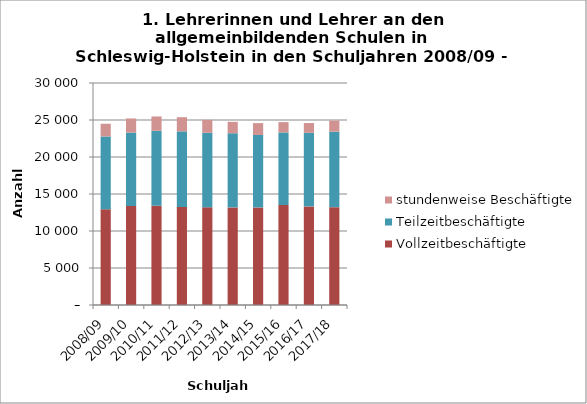
| Category | Vollzeitbeschäftigte | Teilzeitbeschäftigte | stundenweise Beschäftigte |
|---|---|---|---|
| 2008/09 | 12933 | 9836 | 1725 |
| 2009/10 | 13376 | 9922 | 1910 |
| 2010/11 | 13417 | 10129 | 1930 |
| 2011/12 | 13244 | 10218 | 1917 |
| 2012/13 | 13201 | 10069 | 1751 |
| 2013/14 | 13187 | 10024 | 1539 |
| 2014/15 | 13185 | 9793 | 1601 |
| 2015/16 | 13509 | 9810 | 1394 |
| 2016/17 | 13325 | 9943 | 1322 |
| 2017/18 | 13222 | 10208 | 1484 |